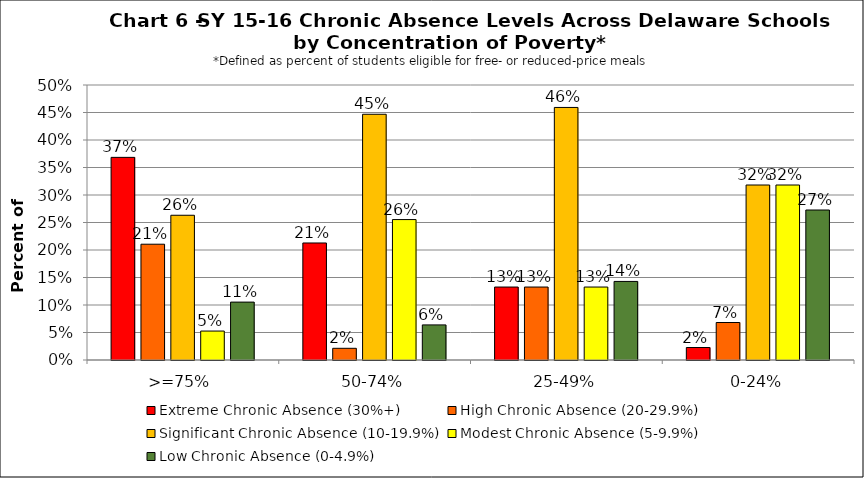
| Category | Extreme Chronic Absence (30%+) | High Chronic Absence (20-29.9%) | Significant Chronic Absence (10-19.9%) | Modest Chronic Absence (5-9.9%) | Low Chronic Absence (0-4.9%) |
|---|---|---|---|---|---|
| 0 | 0.368 | 0.211 | 0.263 | 0.053 | 0.105 |
| 1 | 0.213 | 0.021 | 0.447 | 0.255 | 0.064 |
| 2 | 0.133 | 0.133 | 0.459 | 0.133 | 0.143 |
| 3 | 0.023 | 0.068 | 0.318 | 0.318 | 0.273 |